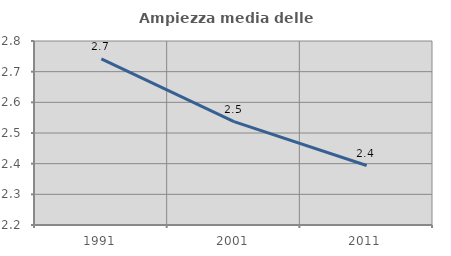
| Category | Ampiezza media delle famiglie |
|---|---|
| 1991.0 | 2.742 |
| 2001.0 | 2.537 |
| 2011.0 | 2.394 |